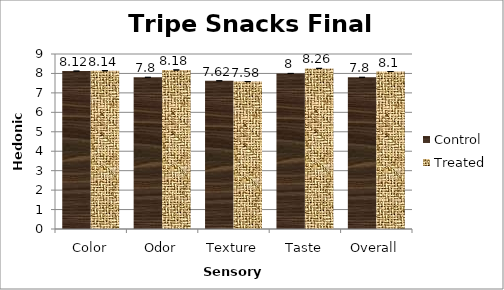
| Category | Control | Treated |
|---|---|---|
| Color | 8.12 | 8.14 |
| Odor | 7.8 | 8.18 |
| Texture | 7.62 | 7.58 |
| Taste | 8 | 8.26 |
| Overall | 7.8 | 8.1 |